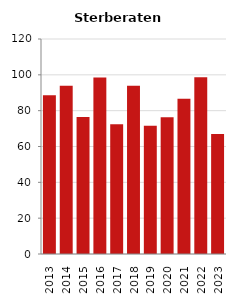
| Category | Sterberate der Bevölkerung ab 80 Jahre (auf Tsd.) |
|---|---|
| 2013.0 | 88.571 |
| 2014.0 | 93.842 |
| 2015.0 | 76.471 |
| 2016.0 | 98.507 |
| 2017.0 | 72.464 |
| 2018.0 | 93.842 |
| 2019.0 | 71.633 |
| 2020.0 | 76.294 |
| 2021.0 | 86.721 |
| 2022.0 | 98.592 |
| 2023.0 | 67.039 |